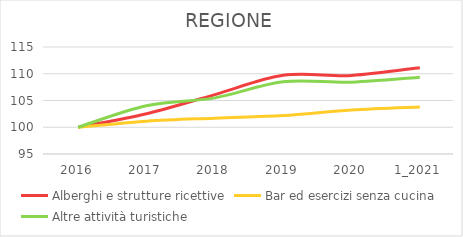
| Category | Alberghi e strutture ricettive | Bar ed esercizi senza cucina | Altre attività turistiche |
|---|---|---|---|
| 2016 | 100 | 100 | 100 |
| 2017 | 102.533 | 101.132 | 104.015 |
| 2018 | 106.106 | 101.705 | 105.495 |
| 2019 | 109.711 | 102.188 | 108.493 |
| 2020 | 109.678 | 103.233 | 108.429 |
| 1_2021 | 111.14 | 103.803 | 109.342 |